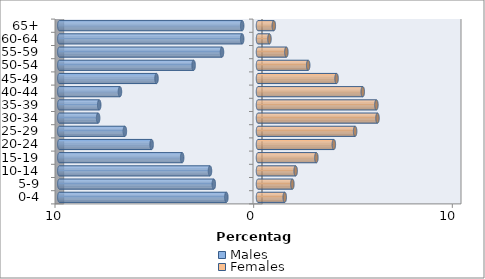
| Category | Males | Females |
|---|---|---|
| 0-4 | -1.593 | 1.346 |
| 5-9 | -2.225 | 1.73 |
| 10-14 | -2.417 | 1.895 |
| 15-19 | -3.818 | 2.939 |
| 20-24 | -5.356 | 3.818 |
| 25-29 | -6.701 | 4.889 |
| 30-34 | -8.047 | 6.015 |
| 35-39 | -7.992 | 5.96 |
| 40-44 | -6.949 | 5.273 |
| 45-49 | -5.108 | 3.955 |
| 50-54 | -3.241 | 2.527 |
| 55-59 | -1.813 | 1.428 |
| 60-64 | -0.796 | 0.577 |
| 65+ | -0.796 | 0.796 |